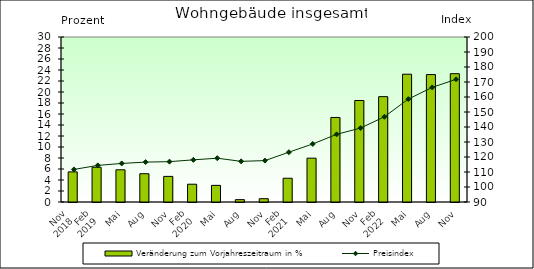
| Category | Veränderung zum Vorjahreszeitraum in % |
|---|---|
| 0 | 5.477 |
| 1 | 6.32 |
| 2 | 5.855 |
| 3 | 5.14 |
| 4 | 4.655 |
| 5 | 3.234 |
| 6 | 3.025 |
| 7 | 0.429 |
| 8 | 0.599 |
| 9 | 4.318 |
| 10 | 7.97 |
| 11 | 15.371 |
| 12 | 18.452 |
| 13 | 19.156 |
| 14 | 23.232 |
| 15 | 23.168 |
| 16 | 23.331 |